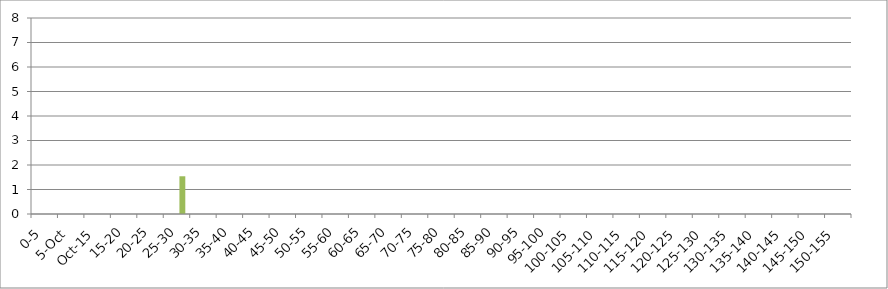
| Category | 119875 | 146067 | 241240 |
|---|---|---|---|
| 0-5 | 0 | 0 | 0 |
| 5.Oct | 0 | 0 | 0 |
| Oct.15 | 0 | 0 | 0 |
| 15-20 | 0 | 0 | 0 |
| 20-25 | 0 | 0 | 0 |
| 25-30 | 0 | 0 | 1.54 |
| 30-35 | 0 | 0 | 0 |
| 35-40 | 0 | 0 | 0 |
| 40-45 | 0 | 0 | 0 |
| 45-50 | 0 | 0 | 0 |
| 50-55 | 0 | 0 | 0 |
| 55-60 | 0 | 0 | 0 |
| 60-65 | 0 | 0 | 0 |
| 65-70 | 0 | 0 | 0 |
| 70-75 | 0 | 0 | 0 |
| 75-80 | 0 | 0 | 0 |
| 80-85 | 0 | 0 | 0 |
| 85-90 | 0 | 0 | 0 |
| 90-95 | 0 | 0 | 0 |
| 95-100 | 0 | 0 | 0 |
| 100-105 | 0 | 0 | 0 |
| 105-110 | 0 | 0 | 0 |
| 110-115 | 0 | 0 | 0 |
| 115-120 | 0 | 0 | 0 |
| 120-125 | 0 | 0 | 0 |
| 125-130 | 0 | 0 | 0 |
| 130-135 | 0 | 0 | 0 |
| 135-140 | 0 | 0 | 0 |
| 140-145 | 0 | 0 | 0 |
| 145-150 | 0 | 0 | 0 |
| 150-155 | 0 | 0 | 0 |